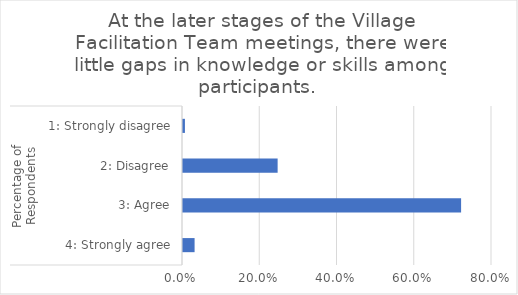
| Category | At the later stages of the Village Facilitation Team meetings, there were little gaps in knowledge or skills among participants.  |
|---|---|
| 0 | 0.03 |
| 1 | 0.72 |
| 2 | 0.245 |
| 3 | 0.005 |